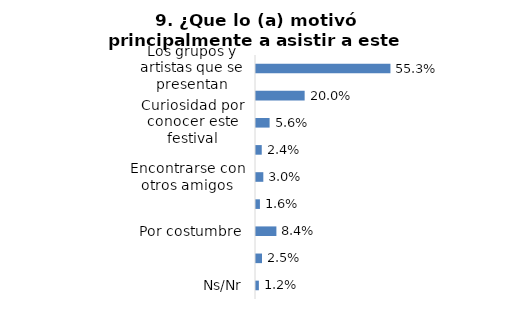
| Category | Series 0 |
|---|---|
| Los grupos y artistas que se presentan | 0.553 |
| Conocer más grupos o bandas  | 0.2 |
| Curiosidad por conocer este festival | 0.056 |
| Conocer gente nueva | 0.024 |
| Encontrarse con otros amigos | 0.03 |
| Porque es gratis | 0.016 |
| Por costumbre | 0.084 |
| Otro | 0.025 |
| Ns/Nr | 0.012 |